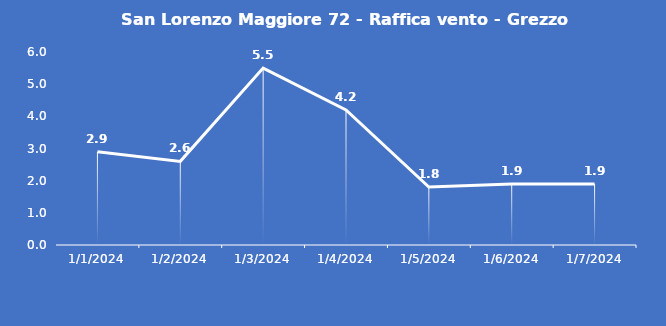
| Category | San Lorenzo Maggiore 72 - Raffica vento - Grezzo (m/s) |
|---|---|
| 1/1/24 | 2.9 |
| 1/2/24 | 2.6 |
| 1/3/24 | 5.5 |
| 1/4/24 | 4.2 |
| 1/5/24 | 1.8 |
| 1/6/24 | 1.9 |
| 1/7/24 | 1.9 |